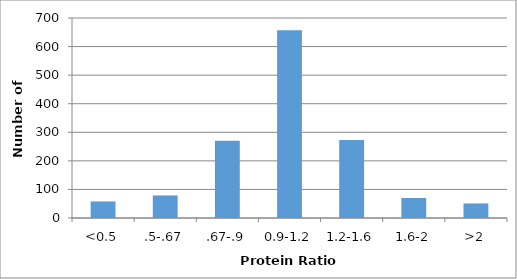
| Category | Series 0 |
|---|---|
| <0.5 | 58 |
| .5-.67 | 79 |
| .67-.9 | 270 |
| 0.9-1.2 | 657 |
| 1.2-1.6 | 273 |
| 1.6-2 | 70 |
| >2 | 51 |